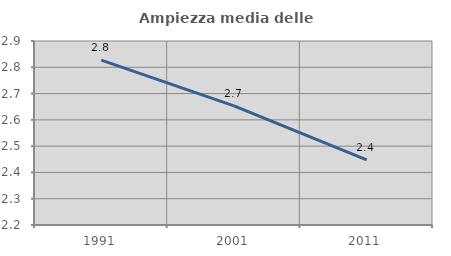
| Category | Ampiezza media delle famiglie |
|---|---|
| 1991.0 | 2.827 |
| 2001.0 | 2.653 |
| 2011.0 | 2.447 |